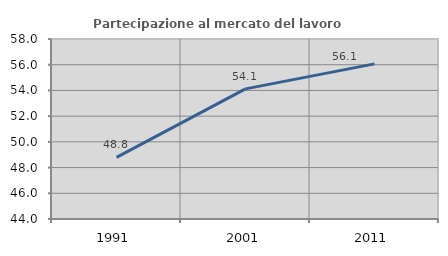
| Category | Partecipazione al mercato del lavoro  femminile |
|---|---|
| 1991.0 | 48.792 |
| 2001.0 | 54.119 |
| 2011.0 | 56.065 |